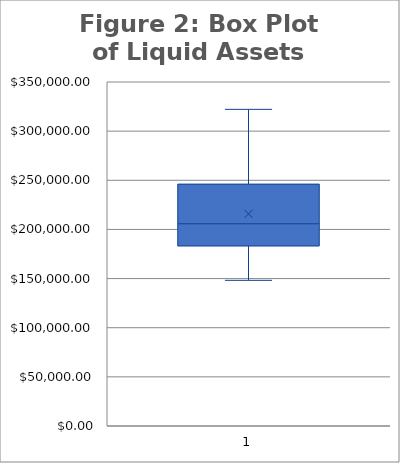
| Category | Liquid Assets |
|---|---|
| Montreal | 277036 |
| Laval  | 236948 |
| Longueuil  | 246101 |
| Le Haut-Saint-Laurent | 208146 |
| Les Jardins-de-Napierville | 205314 |
| Le Haut-Richelieu | 195401 |
| Brome-Missisquoi | 290156 |
| Memphremagog | 322166 |
| Coaticook | 188153 |
| Sherbrooke | 166417 |
| Beauharnois-Salaberry | 148202 |
| Roussillon | 183128 |
| Rouville | 206099 |
| La Haute-Yamaska | 203588 |
| Le Val-Saint Francois | 205738 |
| La Vallée-du-Richelieu | 269136 |
| Vaudreuil-Soulange | 235389 |
| Deux-Montagnes | 154353 |
| Mirabel | 160227 |